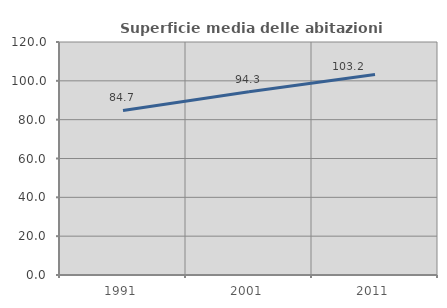
| Category | Superficie media delle abitazioni occupate |
|---|---|
| 1991.0 | 84.723 |
| 2001.0 | 94.345 |
| 2011.0 | 103.241 |